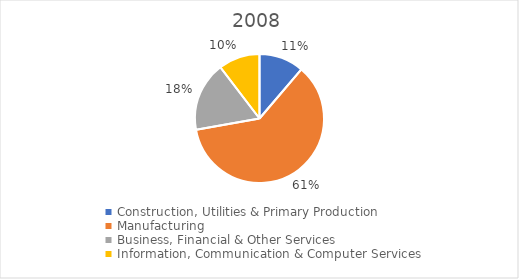
| Category | Series 0 |
|---|---|
| Construction, Utilities & Primary Production  | 0.112 |
| Manufacturing  | 0.61 |
| Business, Financial & Other Services | 0.174 |
| Information, Communication & Computer Services | 0.104 |